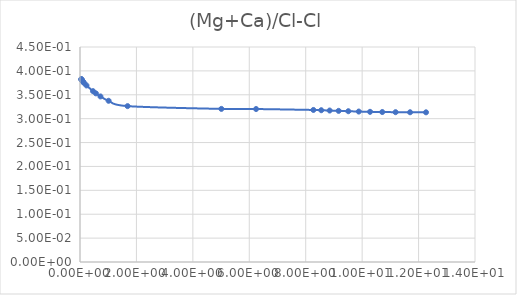
| Category | (Mg+Ca)/Cl |
|---|---|
| 0.045798 | 0.383 |
| 0.050886 | 0.382 |
| 0.057258 | 0.382 |
| 0.065456 | 0.381 |
| 0.076369 | 0.38 |
| 0.091683 | 0.378 |
| 0.11463 | 0.377 |
| 0.15298 | 0.374 |
| 0.2297 | 0.37 |
| 0.46159 | 0.358 |
| 0.56399 | 0.353 |
| 0.72477 | 0.347 |
| 1.0138 | 0.337 |
| 1.6863 | 0.326 |
| 5.0106 | 0.32 |
| 6.241 | 0.32 |
| 8.2722 | 0.318 |
| 8.5505 | 0.318 |
| 8.8482 | 0.317 |
| 9.1674 | 0.316 |
| 9.5104 | 0.316 |
| 9.8801 | 0.315 |
| 10.28 | 0.314 |
| 10.713 | 0.314 |
| 11.185 | 0.314 |
| 11.699 | 0.313 |
| 12.264 | 0.313 |